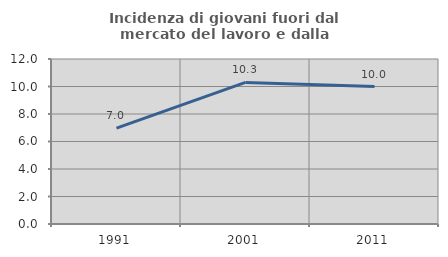
| Category | Incidenza di giovani fuori dal mercato del lavoro e dalla formazione  |
|---|---|
| 1991.0 | 6.977 |
| 2001.0 | 10.294 |
| 2011.0 | 10 |